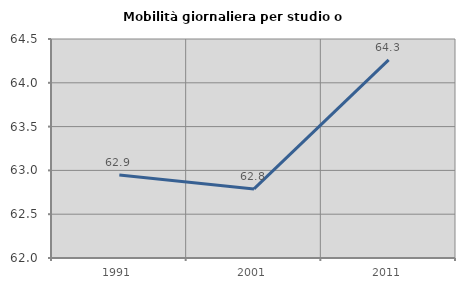
| Category | Mobilità giornaliera per studio o lavoro |
|---|---|
| 1991.0 | 62.948 |
| 2001.0 | 62.788 |
| 2011.0 | 64.261 |